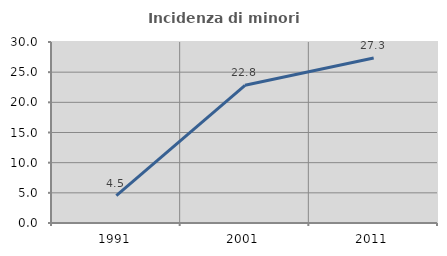
| Category | Incidenza di minori stranieri |
|---|---|
| 1991.0 | 4.545 |
| 2001.0 | 22.819 |
| 2011.0 | 27.333 |